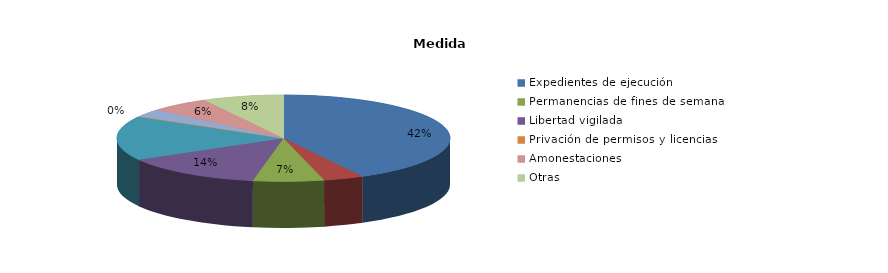
| Category | Series 0 |
|---|---|
| Expedientes de ejecución | 43 |
| Internamientos | 4 |
| Permanencias de fines de semana | 7 |
| Libertad vigilada | 14 |
| Prestaciones en beneficio de la comunidad | 17 |
| Privación de permisos y licencias | 0 |
| Convivencia Familiar Educativa | 3 |
| Amonestaciones | 6 |
| Otras | 8 |